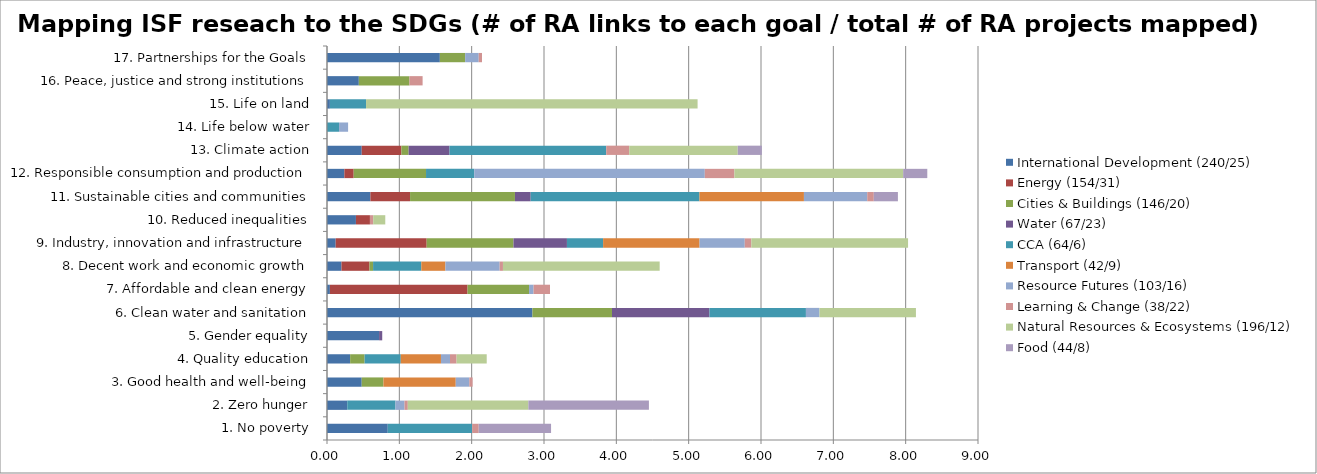
| Category | International Development (240/25) | Energy (154/31) | Cities & Buildings (146/20) | Water (67/23) | CCA (64/6) | Transport (42/9) | Resource Futures (103/16) | Learning & Change (38/22) | Natural Resources & Ecosystems (196/12) | Food (44/8) |
|---|---|---|---|---|---|---|---|---|---|---|
| 1. No poverty | 0.84 | 0 | 0 | 0 | 1.167 | 0 | 0 | 0.091 | 0 | 1 |
| 2. Zero hunger | 0.28 | 0 | 0 | 0 | 0.667 | 0 | 0.125 | 0.045 | 1.667 | 1.667 |
| 3. Good health and well-being | 0.48 | 0 | 0.3 | 0 | 0 | 1 | 0.188 | 0.045 | 0 | 0 |
| 4. Quality education | 0.32 | 0 | 0.2 | 0 | 0.5 | 0.556 | 0.125 | 0.091 | 0.417 | 0 |
| 5. Gender equality | 0.72 | 0 | 0 | 0.043 | 0 | 0 | 0 | 0 | 0 | 0 |
| 6. Clean water and sanitation | 2.84 | 0 | 1.1 | 1.348 | 1.333 | 0 | 0.188 | 0 | 1.333 | 0 |
| 7. Affordable and clean energy | 0.04 | 1.903 | 0.85 | 0 | 0 | 0 | 0.062 | 0.227 | 0 | 0 |
| 8. Decent work and economic growth | 0.2 | 0.387 | 0.05 | 0 | 0.667 | 0.333 | 0.75 | 0.045 | 2.167 | 0 |
| 9. Industry, innovation and infrastructure | 0.12 | 1.258 | 1.2 | 0.739 | 0.5 | 1.333 | 0.625 | 0.091 | 2.167 | 0 |
| 10. Reduced inequalities | 0.4 | 0.194 | 0 | 0 | 0 | 0 | 0 | 0.045 | 0.167 | 0 |
| 11. Sustainable cities and communities | 0.6 | 0.548 | 1.45 | 0.217 | 2.333 | 1.444 | 0.875 | 0.091 | 0 | 0.333 |
| 12. Responsible consumption and production | 0.24 | 0.129 | 1 | 0 | 0.667 | 0 | 3.188 | 0.409 | 2.333 | 0.333 |
| 13. Climate action | 0.48 | 0.548 | 0.1 | 0.565 | 2.167 | 0 | 0 | 0.318 | 1.5 | 0.333 |
| 14. Life below water | 0 | 0 | 0 | 0 | 0.167 | 0 | 0.125 | 0 | 0 | 0 |
| 15. Life on land | 0.04 | 0 | 0 | 0 | 0.5 | 0 | 0 | 0 | 4.583 | 0 |
| 16. Peace, justice and strong institutions | 0.44 | 0 | 0.7 | 0 | 0 | 0 | 0 | 0.182 | 0 | 0 |
| 17. Partnerships for the Goals | 1.56 | 0 | 0.35 | 0 | 0 | 0 | 0.188 | 0.045 | 0 | 0 |